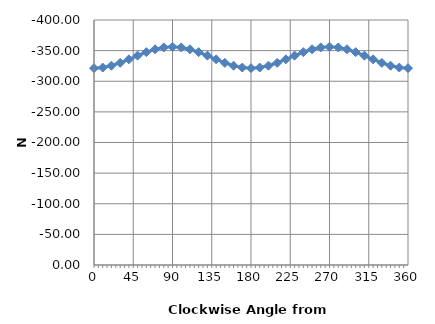
| Category | Series 0 |
|---|---|
| 0.0 | -321.301 |
| 10.0 | -322.356 |
| 20.0 | -325.391 |
| 30.0 | -330.042 |
| 40.0 | -335.747 |
| 50.0 | -341.818 |
| 60.0 | -347.523 |
| 70.0 | -352.174 |
| 80.0 | -355.209 |
| 90.0 | -356.263 |
| 100.0 | -355.209 |
| 110.0 | -352.174 |
| 120.0 | -347.523 |
| 130.0 | -341.818 |
| 140.0 | -335.747 |
| 150.0 | -330.042 |
| 160.0 | -325.391 |
| 170.0 | -322.356 |
| 180.0 | -321.301 |
| 190.0 | -322.356 |
| 200.0 | -325.391 |
| 210.0 | -330.042 |
| 220.0 | -335.747 |
| 230.0 | -341.818 |
| 240.0 | -347.523 |
| 250.0 | -352.174 |
| 260.0 | -355.209 |
| 270.0 | -356.263 |
| 280.0 | -355.209 |
| 290.0 | -352.174 |
| 300.0 | -347.523 |
| 310.0 | -341.818 |
| 320.0 | -335.747 |
| 330.0 | -330.042 |
| 340.0 | -325.391 |
| 350.0 | -322.356 |
| 360.0 | -321.301 |